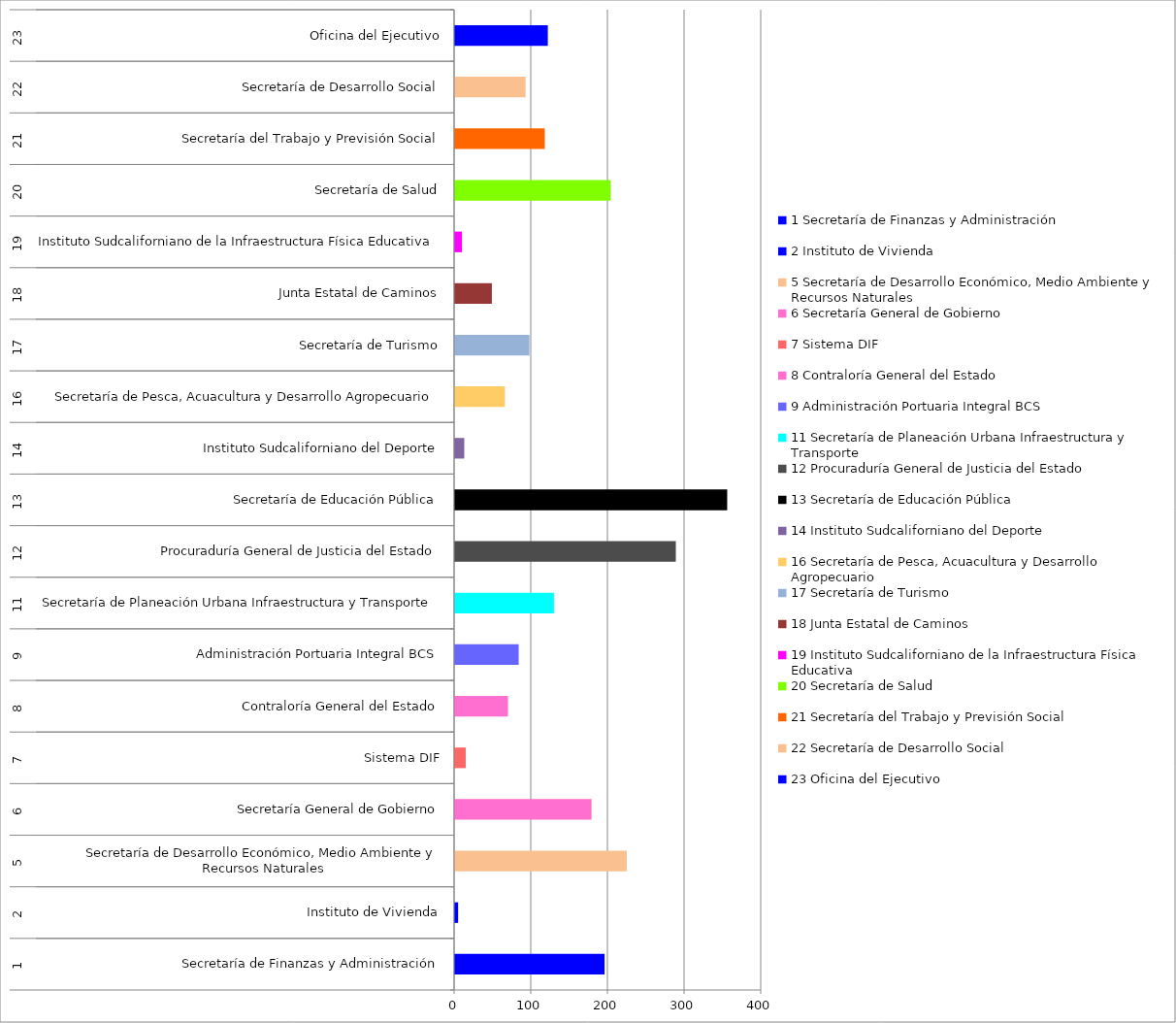
| Category | Series 0 |
|---|---|
| 0 | 195 |
| 1 | 4 |
| 2 | 224 |
| 3 | 178 |
| 4 | 14 |
| 5 | 69 |
| 6 | 83 |
| 7 | 129 |
| 8 | 288 |
| 9 | 355 |
| 10 | 12 |
| 11 | 65 |
| 12 | 97 |
| 13 | 48 |
| 14 | 9 |
| 15 | 203 |
| 16 | 117 |
| 17 | 92 |
| 18 | 121 |